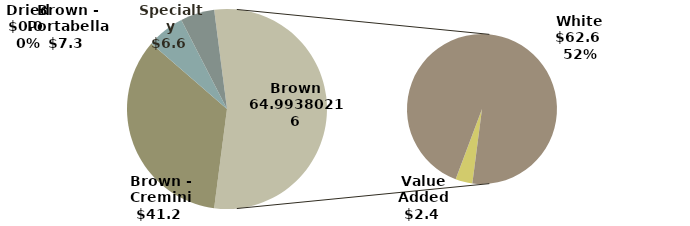
| Category | Brown |
|---|---|
| Brown - Cremini | 41.197 |
| Brown - Portabella | 7.316 |
| Dried | 0.009 |
| Specialty | 6.596 |
| Value Added | 2.379 |
| White | 62.615 |